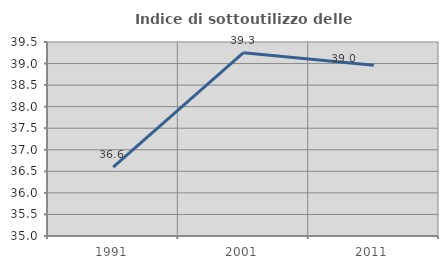
| Category | Indice di sottoutilizzo delle abitazioni  |
|---|---|
| 1991.0 | 36.598 |
| 2001.0 | 39.252 |
| 2011.0 | 38.961 |